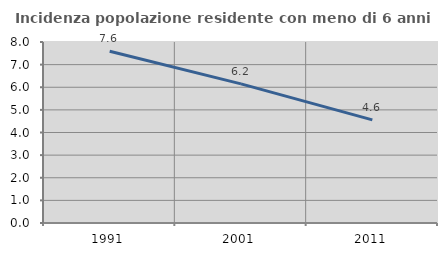
| Category | Incidenza popolazione residente con meno di 6 anni |
|---|---|
| 1991.0 | 7.588 |
| 2001.0 | 6.15 |
| 2011.0 | 4.558 |